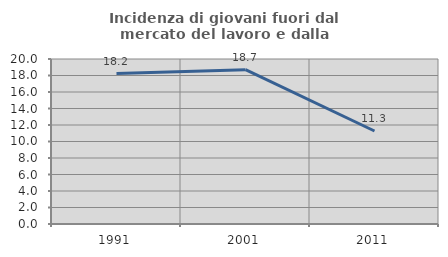
| Category | Incidenza di giovani fuori dal mercato del lavoro e dalla formazione  |
|---|---|
| 1991.0 | 18.242 |
| 2001.0 | 18.705 |
| 2011.0 | 11.275 |